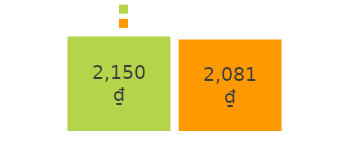
| Category | nhận được | chi tiêu |
|---|---|---|
| khoản tiền nhận được: | 2150 | 2081 |